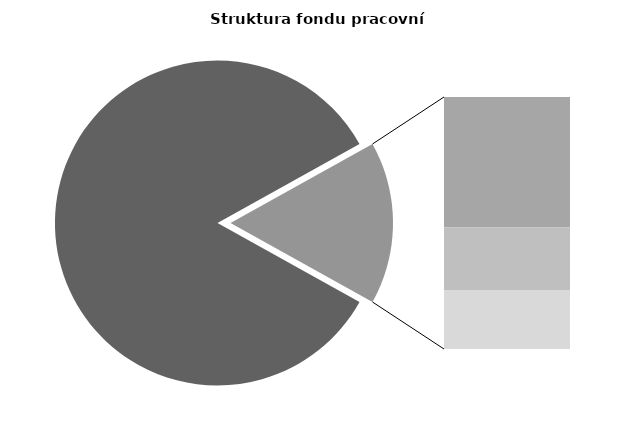
| Category | Series 0 |
|---|---|
| Průměrná měsíční odpracovaná doba bez přesčasu | 141.732 |
| Dovolená | 14.135 |
| Nemoc | 6.788 |
| Jiné | 6.398 |